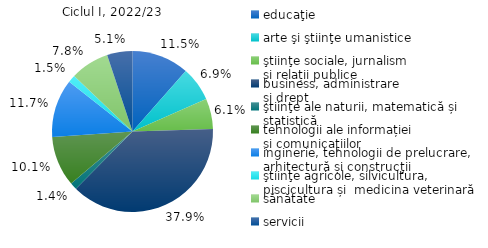
| Category | 2022/23 |
|---|---|
| educaţie | 11.5 |
| arte şi ştiinţe umanistice | 6.9 |
| ştiinţe sociale, jurnalism
și relații publice   | 6.1 |
| business, administrare 
și drept | 37.9 |
| ştiinţe ale naturii, matematică și statistică | 1.4 |
| tehnologii ale informației 
și comunicațiilor  | 10.1 |
| inginerie, tehnologii de prelucrare, 
arhitectură și construcţii | 11.7 |
| ştiinţe agricole, silvicultura, 
piscicultura și  medicina veterinară | 1.5 |
| sănătate | 7.8 |
| servicii | 5.1 |